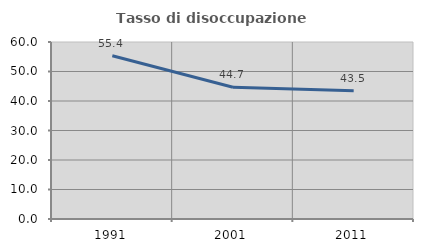
| Category | Tasso di disoccupazione giovanile  |
|---|---|
| 1991.0 | 55.355 |
| 2001.0 | 44.686 |
| 2011.0 | 43.478 |